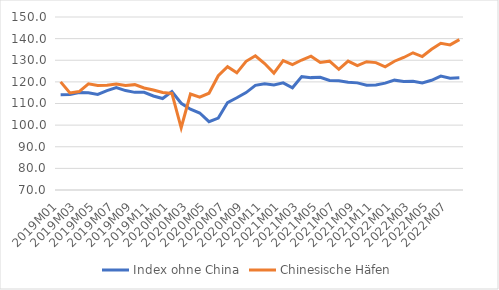
| Category | Index ohne China | Chinesische Häfen |
|---|---|---|
| 2019M01 | 114.008 | 119.999 |
| 2019M02 | 114.13 | 114.904 |
| 2019M03 | 115.033 | 115.531 |
| 2019M04 | 115.006 | 119.122 |
| 2019M05 | 114.205 | 118.366 |
| 2019M06 | 115.994 | 118.49 |
| 2019M07 | 117.395 | 118.975 |
| 2019M08 | 115.967 | 118.368 |
| 2019M09 | 115.149 | 118.723 |
| 2019M10 | 115.174 | 117.187 |
| 2019M11 | 113.489 | 116.24 |
| 2019M12 | 112.308 | 115.116 |
| 2020M01 | 115.505 | 114.657 |
| 2020M02 | 110.099 | 98.778 |
| 2020M03 | 107.39 | 114.378 |
| 2020M04 | 105.607 | 112.971 |
| 2020M05 | 101.6 | 114.747 |
| 2020M06 | 103.253 | 122.852 |
| 2020M07 | 110.443 | 127.011 |
| 2020M08 | 112.646 | 124.179 |
| 2020M09 | 115.058 | 129.523 |
| 2020M10 | 118.397 | 132.081 |
| 2020M11 | 119.143 | 128.463 |
| 2020M12 | 118.58 | 124.045 |
| 2021M01 | 119.524 | 129.836 |
| 2021M02 | 117.287 | 127.965 |
| 2021M03 | 122.424 | 130.119 |
| 2021M04 | 121.966 | 131.89 |
| 2021M05 | 122.082 | 129.016 |
| 2021M06 | 120.643 | 129.587 |
| 2021M07 | 120.54 | 125.811 |
| 2021M08 | 119.827 | 129.609 |
| 2021M09 | 119.542 | 127.506 |
| 2021M10 | 118.406 | 129.316 |
| 2021M11 | 118.545 | 128.906 |
| 2021M12 | 119.403 | 126.983 |
| 2022M01 | 120.798 | 129.546 |
| 2022M02 | 120.185 | 131.286 |
| 2022M03 | 120.233 | 133.457 |
| 2022M04 | 119.47 | 131.724 |
| 2022M05 | 120.753 | 135.049 |
| 2022M06 | 122.649 | 137.856 |
| 2022M07 | 121.715 | 137.092 |
| 2022M08 | 121.932 | 139.535 |